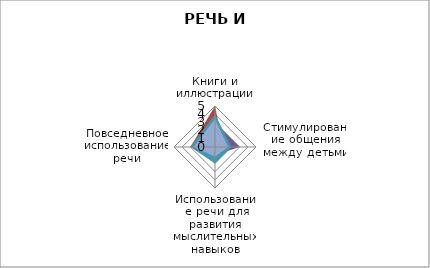
| Category | Series 0 | Series 1 | Series 2 | Series 3 | Series 4 | Series 5 | Series 6 |
|---|---|---|---|---|---|---|---|
| Книги и иллюстрации | 4 | 5 | 3 | 3 | 4 |  | 3.4 |
| Стимулирование общения между детьми | 1 | 1 | 1 | 3 | 2 |  | 1.6 |
| Использование речи для развития мыслительных навыков | 1 | 1 | 1 | 1 | 2 |  | 1.2 |
| Повседневное использование речи | 3 | 3 | 1 | 3 | 3 |  | 2.6 |